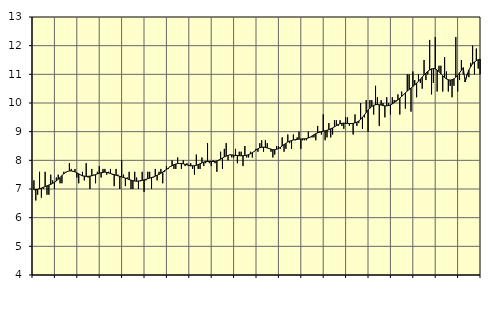
| Category | Piggar | Offentlig förvaltning m.m., SNI 84, 99 |
|---|---|---|
| nan | 7.3 | 6.97 |
| 1.0 | 6.6 | 6.98 |
| 1.0 | 6.8 | 6.99 |
| 1.0 | 7.6 | 7.01 |
| 1.0 | 6.7 | 7.03 |
| 1.0 | 7 | 7.06 |
| 1.0 | 7.6 | 7.08 |
| 1.0 | 6.8 | 7.11 |
| 1.0 | 6.8 | 7.14 |
| 1.0 | 7.5 | 7.16 |
| 1.0 | 7.3 | 7.2 |
| 1.0 | 7 | 7.23 |
| nan | 7.4 | 7.28 |
| 2.0 | 7.5 | 7.34 |
| 2.0 | 7.2 | 7.4 |
| 2.0 | 7.2 | 7.47 |
| 2.0 | 7.6 | 7.53 |
| 2.0 | 7.6 | 7.58 |
| 2.0 | 7.6 | 7.61 |
| 2.0 | 7.9 | 7.63 |
| 2.0 | 7.7 | 7.63 |
| 2.0 | 7.6 | 7.62 |
| 2.0 | 7.7 | 7.6 |
| 2.0 | 7.4 | 7.56 |
| nan | 7.2 | 7.53 |
| 3.0 | 7.5 | 7.49 |
| 3.0 | 7.6 | 7.46 |
| 3.0 | 7.3 | 7.45 |
| 3.0 | 7.9 | 7.44 |
| 3.0 | 7.4 | 7.44 |
| 3.0 | 7 | 7.45 |
| 3.0 | 7.7 | 7.46 |
| 3.0 | 7.5 | 7.48 |
| 3.0 | 7.2 | 7.5 |
| 3.0 | 7.6 | 7.53 |
| 3.0 | 7.8 | 7.55 |
| nan | 7.4 | 7.57 |
| 4.0 | 7.7 | 7.58 |
| 4.0 | 7.7 | 7.59 |
| 4.0 | 7.5 | 7.58 |
| 4.0 | 7.6 | 7.56 |
| 4.0 | 7.7 | 7.54 |
| 4.0 | 7.5 | 7.52 |
| 4.0 | 7.1 | 7.5 |
| 4.0 | 7.7 | 7.48 |
| 4.0 | 7.5 | 7.46 |
| 4.0 | 7 | 7.44 |
| 4.0 | 8 | 7.42 |
| nan | 7.5 | 7.4 |
| 5.0 | 7.1 | 7.38 |
| 5.0 | 7.4 | 7.36 |
| 5.0 | 7.6 | 7.33 |
| 5.0 | 7 | 7.31 |
| 5.0 | 7 | 7.29 |
| 5.0 | 7.6 | 7.28 |
| 5.0 | 7.4 | 7.27 |
| 5.0 | 7 | 7.28 |
| 5.0 | 7.3 | 7.28 |
| 5.0 | 7.6 | 7.3 |
| 5.0 | 6.9 | 7.32 |
| nan | 7.3 | 7.34 |
| 6.0 | 7.6 | 7.36 |
| 6.0 | 7.6 | 7.38 |
| 6.0 | 7 | 7.4 |
| 6.0 | 7.4 | 7.42 |
| 6.0 | 7.7 | 7.45 |
| 6.0 | 7.3 | 7.48 |
| 6.0 | 7.6 | 7.51 |
| 6.0 | 7.7 | 7.55 |
| 6.0 | 7.2 | 7.59 |
| 6.0 | 7.6 | 7.64 |
| 6.0 | 7.8 | 7.68 |
| nan | 7.7 | 7.73 |
| 7.0 | 7.8 | 7.78 |
| 7.0 | 8 | 7.81 |
| 7.0 | 7.7 | 7.85 |
| 7.0 | 7.7 | 7.87 |
| 7.0 | 8.1 | 7.89 |
| 7.0 | 7.9 | 7.89 |
| 7.0 | 7.7 | 7.89 |
| 7.0 | 8 | 7.88 |
| 7.0 | 7.8 | 7.86 |
| 7.0 | 7.9 | 7.84 |
| 7.0 | 7.8 | 7.83 |
| nan | 7.9 | 7.81 |
| 8.0 | 7.7 | 7.81 |
| 8.0 | 7.5 | 7.81 |
| 8.0 | 8.2 | 7.83 |
| 8.0 | 7.7 | 7.85 |
| 8.0 | 7.7 | 7.88 |
| 8.0 | 8.1 | 7.91 |
| 8.0 | 7.8 | 7.94 |
| 8.0 | 7.9 | 7.96 |
| 8.0 | 8.6 | 7.96 |
| 8.0 | 7.9 | 7.96 |
| 8.0 | 7.8 | 7.96 |
| nan | 8 | 7.96 |
| 9.0 | 7.9 | 7.96 |
| 9.0 | 7.6 | 7.98 |
| 9.0 | 8 | 8.01 |
| 9.0 | 8.3 | 8.04 |
| 9.0 | 7.7 | 8.08 |
| 9.0 | 8.4 | 8.12 |
| 9.0 | 8.6 | 8.15 |
| 9.0 | 8 | 8.17 |
| 9.0 | 8.2 | 8.19 |
| 9.0 | 8.1 | 8.19 |
| 9.0 | 8.1 | 8.18 |
| nan | 8.4 | 8.17 |
| 10.0 | 7.9 | 8.17 |
| 10.0 | 8.3 | 8.16 |
| 10.0 | 8.3 | 8.16 |
| 10.0 | 7.8 | 8.16 |
| 10.0 | 8.5 | 8.17 |
| 10.0 | 8.1 | 8.18 |
| 10.0 | 8.1 | 8.2 |
| 10.0 | 8.3 | 8.23 |
| 10.0 | 8.1 | 8.27 |
| 10.0 | 8.3 | 8.31 |
| 10.0 | 8.4 | 8.36 |
| nan | 8.3 | 8.4 |
| 11.0 | 8.6 | 8.44 |
| 11.0 | 8.7 | 8.45 |
| 11.0 | 8.3 | 8.46 |
| 11.0 | 8.7 | 8.45 |
| 11.0 | 8.6 | 8.43 |
| 11.0 | 8.4 | 8.41 |
| 11.0 | 8.3 | 8.39 |
| 11.0 | 8.1 | 8.37 |
| 11.0 | 8.2 | 8.37 |
| 11.0 | 8.5 | 8.39 |
| 11.0 | 8.5 | 8.41 |
| nan | 8.4 | 8.45 |
| 12.0 | 8.8 | 8.5 |
| 12.0 | 8.3 | 8.55 |
| 12.0 | 8.4 | 8.59 |
| 12.0 | 8.9 | 8.64 |
| 12.0 | 8.6 | 8.67 |
| 12.0 | 8.4 | 8.69 |
| 12.0 | 8.9 | 8.71 |
| 12.0 | 8.7 | 8.72 |
| 12.0 | 8.8 | 8.73 |
| 12.0 | 9 | 8.74 |
| 12.0 | 8.4 | 8.74 |
| nan | 8.7 | 8.75 |
| 13.0 | 8.7 | 8.75 |
| 13.0 | 8.7 | 8.76 |
| 13.0 | 9 | 8.78 |
| 13.0 | 8.8 | 8.81 |
| 13.0 | 8.8 | 8.85 |
| 13.0 | 8.8 | 8.89 |
| 13.0 | 8.7 | 8.93 |
| 13.0 | 9.2 | 8.96 |
| 13.0 | 9 | 8.98 |
| 13.0 | 8.9 | 9 |
| 13.0 | 9.6 | 9.02 |
| nan | 8.7 | 9.03 |
| 14.0 | 8.8 | 9.05 |
| 14.0 | 9.3 | 9.07 |
| 14.0 | 8.8 | 9.1 |
| 14.0 | 8.9 | 9.13 |
| 14.0 | 9.4 | 9.17 |
| 14.0 | 9.4 | 9.21 |
| 14.0 | 9.2 | 9.25 |
| 14.0 | 9.4 | 9.28 |
| 14.0 | 9.2 | 9.29 |
| 14.0 | 9.1 | 9.3 |
| 14.0 | 9.5 | 9.29 |
| nan | 9.5 | 9.29 |
| 15.0 | 9.2 | 9.28 |
| 15.0 | 9.3 | 9.28 |
| 15.0 | 8.9 | 9.29 |
| 15.0 | 9.6 | 9.31 |
| 15.0 | 9.2 | 9.33 |
| 15.0 | 9.3 | 9.37 |
| 15.0 | 10 | 9.43 |
| 15.0 | 9.1 | 9.5 |
| 15.0 | 9.5 | 9.58 |
| 15.0 | 10.1 | 9.67 |
| 15.0 | 9 | 9.75 |
| nan | 10.1 | 9.82 |
| 16.0 | 10.1 | 9.88 |
| 16.0 | 9.6 | 9.92 |
| 16.0 | 10.6 | 9.94 |
| 16.0 | 10.2 | 9.95 |
| 16.0 | 9.2 | 9.94 |
| 16.0 | 10.1 | 9.93 |
| 16.0 | 10 | 9.91 |
| 16.0 | 9.5 | 9.9 |
| 16.0 | 10.2 | 9.9 |
| 16.0 | 10 | 9.91 |
| 16.0 | 9.6 | 9.93 |
| nan | 10.2 | 9.97 |
| 17.0 | 10.1 | 10.01 |
| 17.0 | 10.1 | 10.06 |
| 17.0 | 10.3 | 10.11 |
| 17.0 | 9.6 | 10.17 |
| 17.0 | 10.4 | 10.23 |
| 17.0 | 10.3 | 10.29 |
| 17.0 | 9.8 | 10.35 |
| 17.0 | 11 | 10.42 |
| 17.0 | 11 | 10.47 |
| 17.0 | 9.7 | 10.52 |
| 17.0 | 11.1 | 10.58 |
| nan | 10.8 | 10.63 |
| 18.0 | 10.2 | 10.69 |
| 18.0 | 11 | 10.76 |
| 18.0 | 10.7 | 10.83 |
| 18.0 | 10.5 | 10.9 |
| 18.0 | 11.5 | 10.98 |
| 18.0 | 10.8 | 11.04 |
| 18.0 | 11 | 11.11 |
| 18.0 | 12.2 | 11.15 |
| 18.0 | 10.3 | 11.19 |
| 18.0 | 10.7 | 11.2 |
| 18.0 | 12.3 | 11.19 |
| nan | 10.4 | 11.15 |
| 19.0 | 11.3 | 11.09 |
| 19.0 | 11.3 | 11.02 |
| 19.0 | 10.4 | 10.95 |
| 19.0 | 11.6 | 10.89 |
| 19.0 | 11.1 | 10.84 |
| 19.0 | 10.4 | 10.81 |
| 19.0 | 10.6 | 10.8 |
| 19.0 | 10.2 | 10.81 |
| 19.0 | 10.6 | 10.84 |
| 19.0 | 12.3 | 10.9 |
| 19.0 | 10.4 | 10.97 |
| nan | 10.8 | 11.05 |
| 20.0 | 11.5 | 11.14 |
| 20.0 | 11 | 11.23 |
| 20.0 | 10.8 | 10.74 |
| 20.0 | 11 | 10.98 |
| 20.0 | 10.9 | 11.15 |
| 20.0 | 11.4 | 11.27 |
| 20.0 | 12 | 11.37 |
| 20.0 | 11 | 11.43 |
| 20.0 | 11.9 | 11.48 |
| 20.0 | 11.2 | 11.51 |
| 20.0 | 11 | 11.53 |